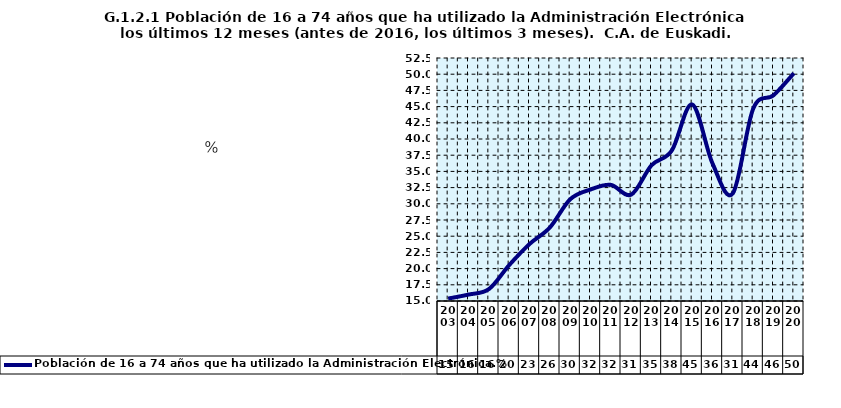
| Category | Población de 16 a 74 años que ha utilizado la Administración Electrónica.% |
|---|---|
| 2003.0 | 15.375 |
| 2004.0 | 15.991 |
| 2005.0 | 16.831 |
| 2006.0 | 20.537 |
| 2007.0 | 23.794 |
| 2008.0 | 26.338 |
| 2009.0 | 30.694 |
| 2010.0 | 32.207 |
| 2011.0 | 32.922 |
| 2012.0 | 31.411 |
| 2013.0 | 35.945 |
| 2014.0 | 38.224 |
| 2015.0 | 45.329 |
| 2016.0 | 36.231 |
| 2017.0 | 31.608 |
| 2018.0 | 44.663 |
| 2019.0 | 46.748 |
| 2020.0 | 50.139 |